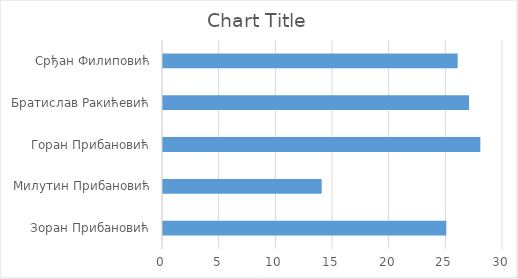
| Category | Series 0 |
|---|---|
| Зоран Прибановић | 25 |
| Милутин Прибановић | 14 |
| Горан Прибановић | 28 |
| Братислав Ракићевић | 27 |
| Срђан Филиповић | 26 |